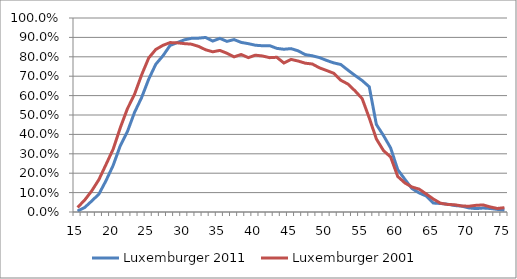
| Category | Luxemburger 2011 | Luxemburger 2001 |
|---|---|---|
| 15.0 | 0.005 | 0.024 |
| 16.0 | 0.023 | 0.061 |
| 17.0 | 0.057 | 0.109 |
| 18.0 | 0.092 | 0.167 |
| 19.0 | 0.162 | 0.245 |
| 20.0 | 0.24 | 0.324 |
| 21.0 | 0.341 | 0.434 |
| 22.0 | 0.414 | 0.532 |
| 23.0 | 0.513 | 0.606 |
| 24.0 | 0.59 | 0.706 |
| 25.0 | 0.685 | 0.794 |
| 26.0 | 0.762 | 0.838 |
| 27.0 | 0.805 | 0.859 |
| 28.0 | 0.858 | 0.873 |
| 29.0 | 0.873 | 0.872 |
| 30.0 | 0.887 | 0.868 |
| 31.0 | 0.895 | 0.865 |
| 32.0 | 0.896 | 0.854 |
| 33.0 | 0.9 | 0.836 |
| 34.0 | 0.881 | 0.826 |
| 35.0 | 0.895 | 0.833 |
| 36.0 | 0.88 | 0.818 |
| 37.0 | 0.889 | 0.8 |
| 38.0 | 0.874 | 0.812 |
| 39.0 | 0.868 | 0.796 |
| 40.0 | 0.86 | 0.808 |
| 41.0 | 0.857 | 0.804 |
| 42.0 | 0.858 | 0.796 |
| 43.0 | 0.843 | 0.797 |
| 44.0 | 0.839 | 0.768 |
| 45.0 | 0.842 | 0.787 |
| 46.0 | 0.831 | 0.778 |
| 47.0 | 0.811 | 0.767 |
| 48.0 | 0.805 | 0.763 |
| 49.0 | 0.796 | 0.743 |
| 50.0 | 0.781 | 0.729 |
| 51.0 | 0.769 | 0.715 |
| 52.0 | 0.76 | 0.679 |
| 53.0 | 0.731 | 0.66 |
| 54.0 | 0.704 | 0.624 |
| 55.0 | 0.678 | 0.585 |
| 56.0 | 0.645 | 0.485 |
| 57.0 | 0.451 | 0.377 |
| 58.0 | 0.394 | 0.316 |
| 59.0 | 0.331 | 0.284 |
| 60.0 | 0.219 | 0.183 |
| 61.0 | 0.169 | 0.15 |
| 62.0 | 0.121 | 0.129 |
| 63.0 | 0.099 | 0.118 |
| 64.0 | 0.082 | 0.093 |
| 65.0 | 0.046 | 0.067 |
| 66.0 | 0.044 | 0.046 |
| 67.0 | 0.04 | 0.039 |
| 68.0 | 0.033 | 0.037 |
| 69.0 | 0.03 | 0.031 |
| 70.0 | 0.021 | 0.03 |
| 71.0 | 0.017 | 0.034 |
| 72.0 | 0.02 | 0.036 |
| 73.0 | 0.018 | 0.026 |
| 74.0 | 0.013 | 0.018 |
| 75.0 | 0.01 | 0.022 |